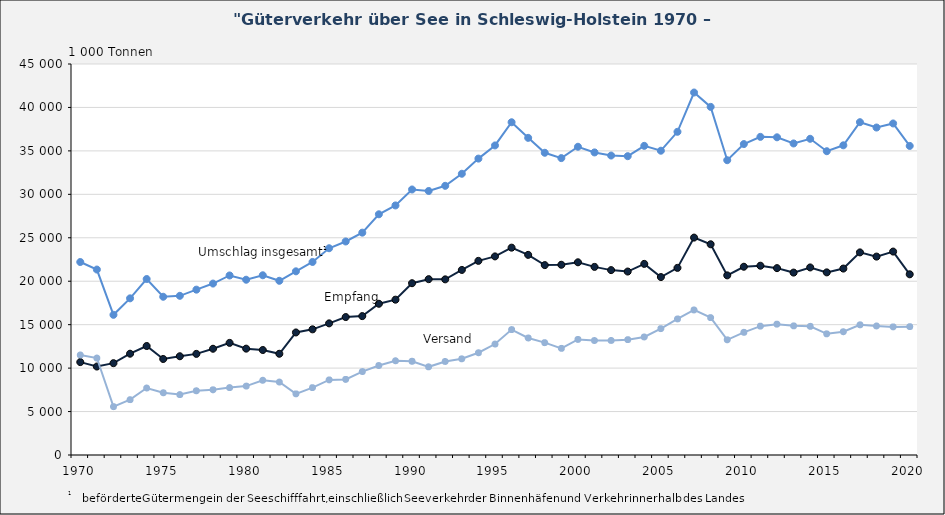
| Category | Umschlag insgesamt1 | Empfang | Versand |
|---|---|---|---|
| 1970.0 | 22209 | 10692 | 11517 |
| 1971.0 | 21343 | 10182 | 11161 |
| 1972.0 | 16132 | 10568 | 5564 |
| 1973.0 | 18029 | 11659 | 6370 |
| 1974.0 | 20254 | 12543 | 7711 |
| 1975.0 | 18212 | 11049 | 7163 |
| 1976.0 | 18320 | 11365 | 6955 |
| 1977.0 | 19029 | 11637 | 7392 |
| 1978.0 | 19731 | 12229 | 7502 |
| 1979.0 | 20663 | 12904 | 7759 |
| 1980.0 | 20173 | 12240 | 7933 |
| 1981.0 | 20685 | 12083 | 8602 |
| 1982.0 | 20049 | 11651 | 8398 |
| 1983.0 | 21138 | 14103 | 7035 |
| 1984.0 | 22216 | 14463 | 7753 |
| 1985.0 | 23795 | 15150 | 8645 |
| 1986.0 | 24575 | 15876 | 8699 |
| 1987.0 | 25589 | 15985 | 9604 |
| 1988.0 | 27703 | 17405 | 10298 |
| 1989.0 | 28722 | 17875 | 10847 |
| 1990.0 | 30558 | 19771 | 10787 |
| 1991.0 | 30385 | 20237 | 10148 |
| 1992.0 | 30980 | 20215 | 10765 |
| 1993.0 | 32368 | 21298 | 11070 |
| 1994.0 | 34111 | 22342 | 11769 |
| 1995.0 | 35626 | 22856 | 12770 |
| 1996.0 | 38297 | 23862 | 14435 |
| 1997.0 | 36501 | 23033 | 13468 |
| 1998.0 | 34783 | 21855 | 12929 |
| 1999.0 | 34170 | 21895 | 12275 |
| 2000.0 | 35476 | 22178 | 13298 |
| 2001.0 | 34823 | 21649 | 13174 |
| 2002.0 | 34465 | 21278 | 13187 |
| 2003.0 | 34390 | 21114 | 13277 |
| 2004.0 | 35581 | 21995 | 13585 |
| 2005.0 | 35021 | 20478 | 14543 |
| 2006.0 | 37196 | 21535 | 15661 |
| 2007.0 | 41718 | 25022 | 16695 |
| 2008.0 | 40064 | 24252 | 15812 |
| 2009.0 | 33928 | 20674 | 13254 |
| 2010.0 | 35786 | 21667 | 14120 |
| 2011.0 | 36614 | 21784 | 14830 |
| 2012.0 | 36563 | 21505 | 15059 |
| 2013.0 | 35856 | 20994 | 14862 |
| 2014.0 | 36393 | 21586 | 14807 |
| 2015.0 | 34963 | 21019 | 13944 |
| 2016.0 | 35642 | 21457 | 14185 |
| 2017.0 | 38302 | 23318 | 14984 |
| 2018.0 | 37688 | 22834 | 14854 |
| 2019.0 | 38156 | 23413 | 14743 |
| 2020.0 | 35571 | 20797 | 14774 |